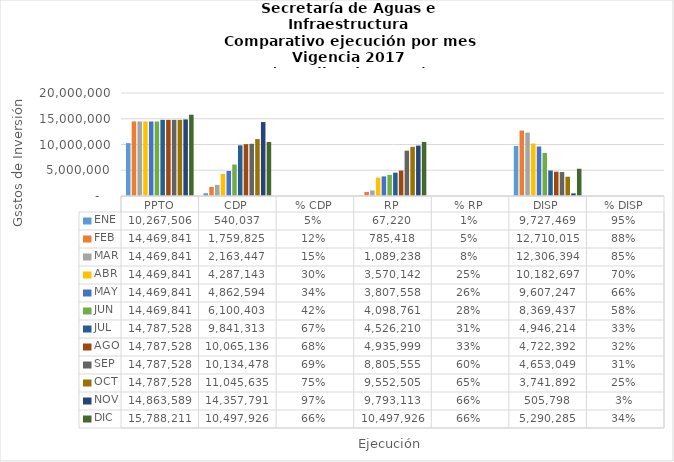
| Category | ENE | FEB | MAR | ABR | MAY  | JUN  | JUL | AGO | SEP | OCT | NOV | DIC |
|---|---|---|---|---|---|---|---|---|---|---|---|---|
| PPTO | 10267506.145 | 14469840.704 | 14469840.704 | 14469840.704 | 14469840.704 | 14469840.704 | 14787527.534 | 14787527.534 | 14787527.534 | 14787527.534 | 14863589.1 | 15788210.895 |
| CDP | 540037.495 | 1759825.348 | 2163447.077 | 4287143.243 | 4862593.596 | 6100403.405 | 9841313.14 | 10065135.952 | 10134478.217 | 11045635.325 | 14357791.288 | 10497926.393 |
| % CDP | 0.053 | 0.122 | 0.15 | 0.296 | 0.336 | 0.422 | 0.666 | 0.681 | 0.685 | 0.747 | 0.966 | 0.665 |
| RP | 67220 | 785418.248 | 1089237.627 | 3570141.849 | 3807558.204 | 4098761.205 | 4526210.155 | 4935998.722 | 8805555.326 | 9552504.549 | 9793113.334 | 10497926.393 |
| % RP | 0.007 | 0.054 | 0.075 | 0.247 | 0.263 | 0.283 | 0.306 | 0.334 | 0.595 | 0.646 | 0.659 | 0.665 |
| DISP | 9727468.65 | 12710015.356 | 12306393.627 | 10182697.461 | 9607247.108 | 8369437.299 | 4946214.394 | 4722391.582 | 4653049.317 | 3741892.209 | 505797.812 | 5290284.502 |
| % DISP | 0.947 | 0.878 | 0.85 | 0.704 | 0.664 | 0.578 | 0.334 | 0.319 | 0.315 | 0.253 | 0.034 | 0.335 |